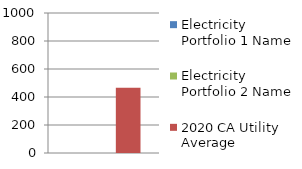
| Category | Electricity Portfolio 1 Name | Electricity Portfolio 2 Name | 2020 CA Utility Average |
|---|---|---|---|
| 0 | 0 | 0 | 466 |